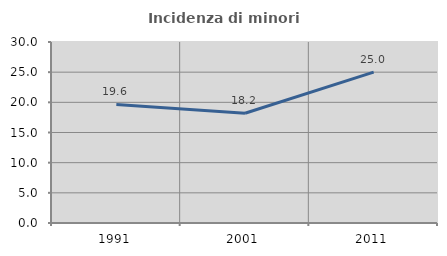
| Category | Incidenza di minori stranieri |
|---|---|
| 1991.0 | 19.643 |
| 2001.0 | 18.182 |
| 2011.0 | 25 |